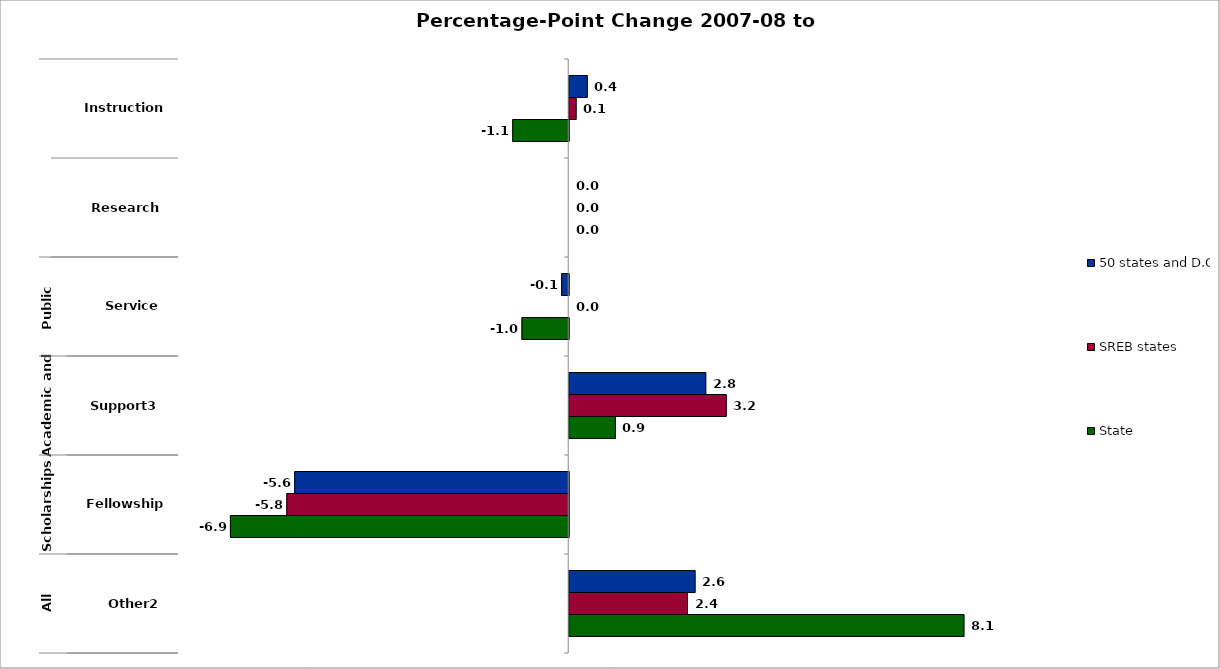
| Category | 50 states and D.C. | SREB states | State |
|---|---|---|---|
| 0 | 0.372 | 0.144 | -1.148 |
| 1 | 0 | 0 | 0 |
| 2 | -0.145 | 0 | -0.959 |
| 3 | 2.802 | 3.221 | 0.947 |
| 4 | -5.618 | -5.779 | -6.935 |
| 5 | 2.582 | 2.426 | 8.095 |